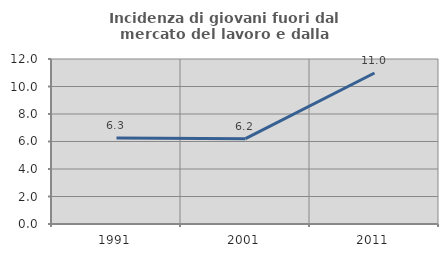
| Category | Incidenza di giovani fuori dal mercato del lavoro e dalla formazione  |
|---|---|
| 1991.0 | 6.256 |
| 2001.0 | 6.205 |
| 2011.0 | 10.981 |